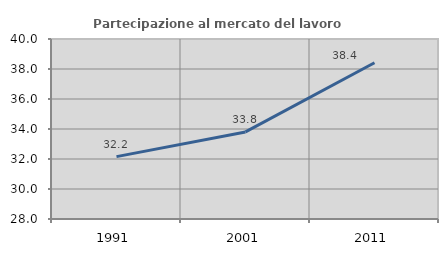
| Category | Partecipazione al mercato del lavoro  femminile |
|---|---|
| 1991.0 | 32.157 |
| 2001.0 | 33.805 |
| 2011.0 | 38.415 |